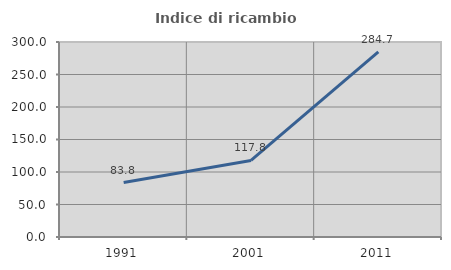
| Category | Indice di ricambio occupazionale  |
|---|---|
| 1991.0 | 83.779 |
| 2001.0 | 117.82 |
| 2011.0 | 284.694 |